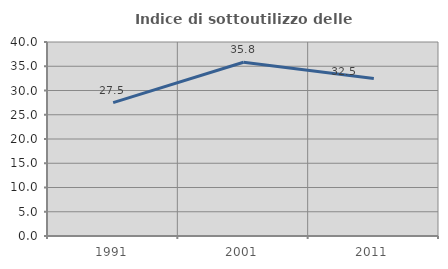
| Category | Indice di sottoutilizzo delle abitazioni  |
|---|---|
| 1991.0 | 27.506 |
| 2001.0 | 35.821 |
| 2011.0 | 32.49 |